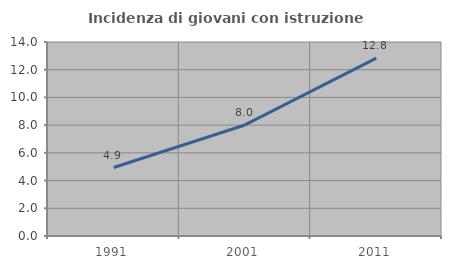
| Category | Incidenza di giovani con istruzione universitaria |
|---|---|
| 1991.0 | 4.943 |
| 2001.0 | 8.014 |
| 2011.0 | 12.834 |